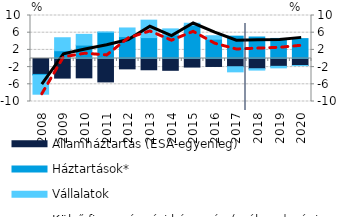
| Category | Államháztartás (ESA-egyenleg) | Háztartások* | Vállalatok |
|---|---|---|---|
| 2008.0 | -3.698 | -0.202 | -4.404 |
| 2009.0 | -4.561 | 1.816 | 3.012 |
| 2010.0 | -4.497 | 3.122 | 2.493 |
| 2011.0 | -5.441 | 6.096 | 0.059 |
| 2012.0 | -2.409 | 5.095 | 2.005 |
| 2013.0 | -2.621 | 4.863 | 4.054 |
| 2014.0 | -2.747 | 5.462 | 1.426 |
| 2015.0 | -1.994 | 7.706 | 0.495 |
| 2016.0 | -1.854 | 4.503 | 0.791 |
| 2017.0 | -1.913 | 5.193 | -1.191 |
| 2018.0 | -2.38 | 5.002 | -0.316 |
| 2019.0 | -1.825 | 4.664 | -0.353 |
| 2020.0 | -1.625 | 4.624 | -0.03 |